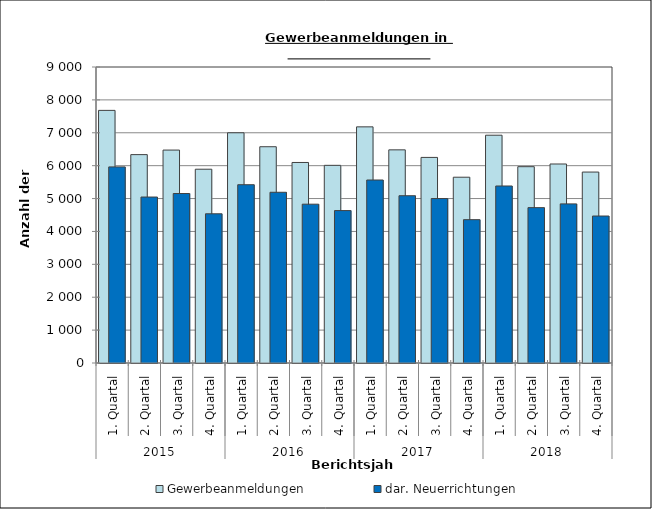
| Category | Gewerbeanmeldungen | dar. Neuerrichtungen |
|---|---|---|
| 0 | 7681 | 5962 |
| 1 | 6336 | 5046 |
| 2 | 6474 | 5153 |
| 3 | 5892 | 4537 |
| 4 | 7000 | 5421 |
| 5 | 6576 | 5191 |
| 6 | 6097 | 4829 |
| 7 | 6010 | 4634 |
| 8 | 7180 | 5564 |
| 9 | 6481 | 5086 |
| 10 | 6251 | 5000 |
| 11 | 5649 | 4358 |
| 12 | 6926 | 5382 |
| 13 | 5969 | 4724 |
| 14 | 6051 | 4838 |
| 15 | 5806 | 4469 |